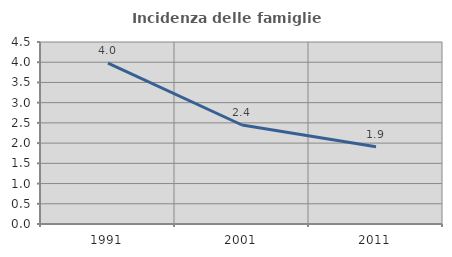
| Category | Incidenza delle famiglie numerose |
|---|---|
| 1991.0 | 3.978 |
| 2001.0 | 2.448 |
| 2011.0 | 1.91 |